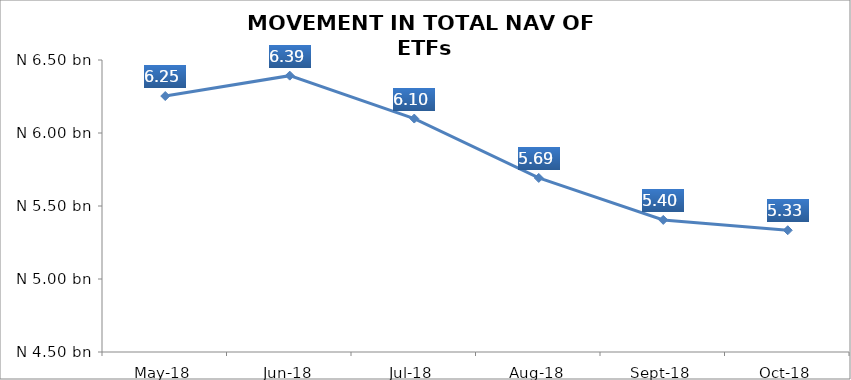
| Category | Series 0 |
|---|---|
| 2018-05-01 | 6253239764.9 |
| 2018-06-01 | 6392823777.55 |
| 2018-07-01 | 6098924594.48 |
| 2018-08-01 | 5692304392.97 |
| 2018-09-01 | 5404681331.97 |
| 2018-10-01 | 5333989892.62 |